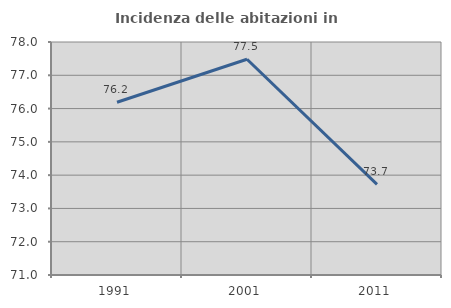
| Category | Incidenza delle abitazioni in proprietà  |
|---|---|
| 1991.0 | 76.19 |
| 2001.0 | 77.481 |
| 2011.0 | 73.723 |